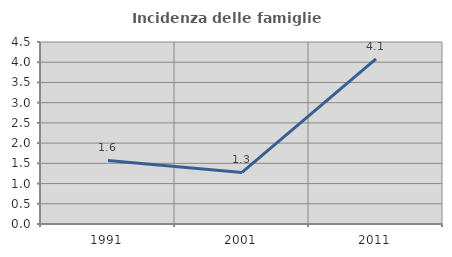
| Category | Incidenza delle famiglie numerose |
|---|---|
| 1991.0 | 1.571 |
| 2001.0 | 1.276 |
| 2011.0 | 4.082 |